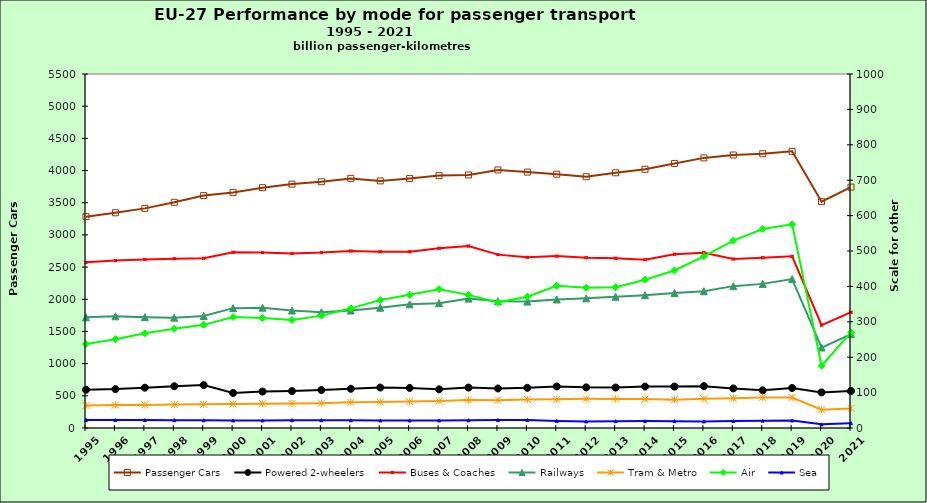
| Category | Passenger Cars |
|---|---|
| 1995.0 | 3283.764 |
| 1996.0 | 3343.401 |
| 1997.0 | 3412.199 |
| 1998.0 | 3507.134 |
| 1999.0 | 3610.558 |
| 2000.0 | 3660.355 |
| 2001.0 | 3734.216 |
| 2002.0 | 3789.305 |
| 2003.0 | 3826.196 |
| 2004.0 | 3878.163 |
| 2005.0 | 3839.179 |
| 2006.0 | 3875.261 |
| 2007.0 | 3921.256 |
| 2008.0 | 3931.624 |
| 2009.0 | 4009.212 |
| 2010.0 | 3975.851 |
| 2011.0 | 3943.643 |
| 2012.0 | 3904.543 |
| 2013.0 | 3964.795 |
| 2014.0 | 4020.262 |
| 2015.0 | 4110.545 |
| 2016.0 | 4196.602 |
| 2017.0 | 4241.358 |
| 2018.0 | 4261.043 |
| 2019.0 | 4298.322 |
| 2020.0 | 3516.899 |
| 2021.0 | 3742.236 |